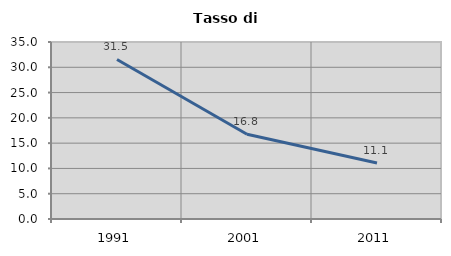
| Category | Tasso di disoccupazione   |
|---|---|
| 1991.0 | 31.549 |
| 2001.0 | 16.761 |
| 2011.0 | 11.075 |